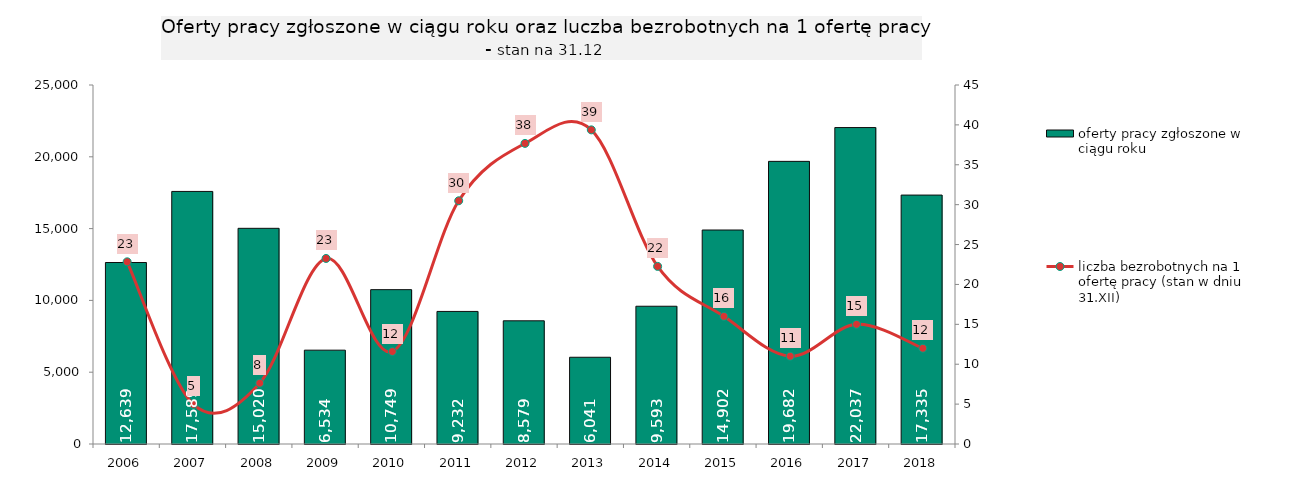
| Category | oferty pracy zgłoszone w ciągu roku |
|---|---|
| 2006.0 | 12639 |
| 2007.0 | 17589 |
| 2008.0 | 15020 |
| 2009.0 | 6534 |
| 2010.0 | 10749 |
| 2011.0 | 9232 |
| 2012.0 | 8579 |
| 2013.0 | 6041 |
| 2014.0 | 9593 |
| 2015.0 | 14902 |
| 2016.0 | 19682 |
| 2017.0 | 22037 |
| 2018.0 | 17335 |